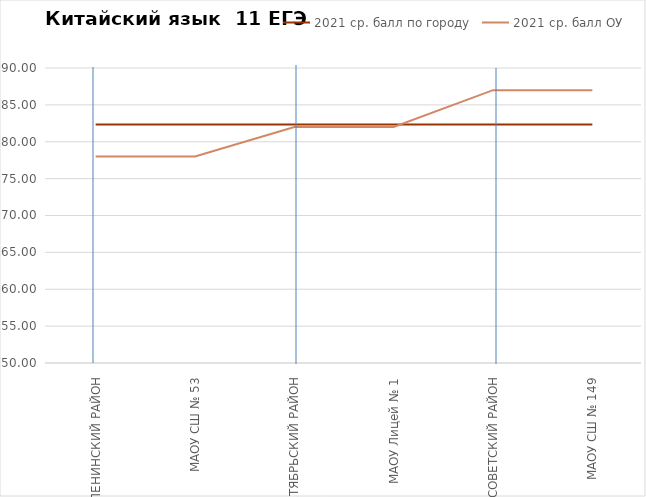
| Category | 2021 ср. балл по городу | 2021 ср. балл ОУ |
|---|---|---|
| ЛЕНИНСКИЙ РАЙОН | 82.33 | 78 |
| МАОУ СШ № 53 | 82.33 | 78 |
| ОКТЯБРЬСКИЙ РАЙОН | 82.33 | 82 |
| МАОУ Лицей № 1 | 82.33 | 82 |
| СОВЕТСКИЙ РАЙОН | 82.33 | 87 |
| МАОУ СШ № 149 | 82.33 | 87 |